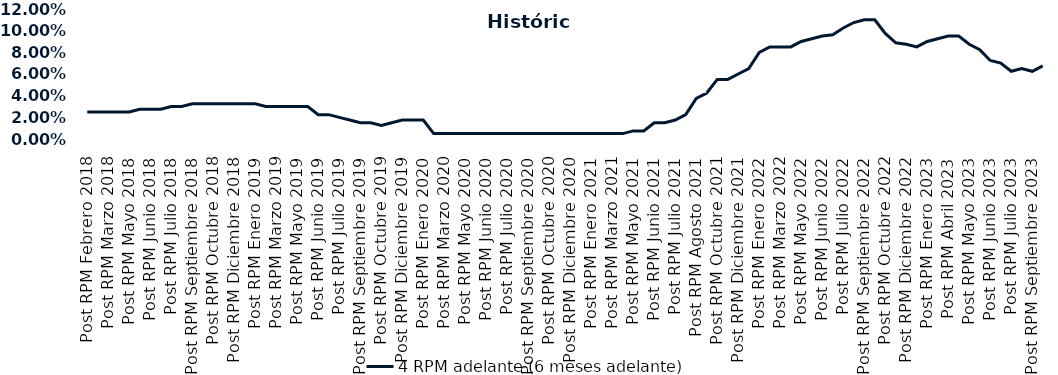
| Category | 4 RPM adelante (6 meses adelante) |
|---|---|
| Post RPM Febrero 2018 | 0.025 |
| Pre RPM Marzo 2018 | 0.025 |
| Post RPM Marzo 2018 | 0.025 |
| Pre RPM Mayo 2018 | 0.025 |
| Post RPM Mayo 2018 | 0.025 |
| Pre RPM Junio 2018 | 0.028 |
| Post RPM Junio 2018 | 0.028 |
| Pre RPM Julio 2018 | 0.028 |
| Post RPM Julio 2018 | 0.03 |
| Pre RPM Septiembre 2018 | 0.03 |
| Post RPM Septiembre 2018 | 0.032 |
| Pre RPM Octubre 2018 | 0.032 |
| Post RPM Octubre 2018 | 0.032 |
| Pre RPM Diciembre 2018 | 0.032 |
| Post RPM Diciembre 2018 | 0.032 |
| Pre RPM Enero 2019 | 0.032 |
| Post RPM Enero 2019 | 0.032 |
| Pre RPM Marzo 2019 | 0.03 |
| Post RPM Marzo 2019 | 0.03 |
| Pre RPM Mayo 2019 | 0.03 |
| Post RPM Mayo 2019 | 0.03 |
| Pre RPM Junio 2019 | 0.03 |
| Post RPM Junio 2019 | 0.022 |
| Pre RPM Julio 2019 | 0.022 |
| Post RPM Julio 2019 | 0.02 |
| Pre RPM Septiembre 2019 | 0.018 |
| Post RPM Septiembre 2019 | 0.015 |
| Pre RPM Octubre 2019 | 0.015 |
| Post RPM Octubre 2019 | 0.012 |
| Pre RPM Diciembre 2019 | 0.015 |
| Post RPM Diciembre 2019 | 0.018 |
| Pre RPM Enero 2020 | 0.018 |
| Post RPM Enero 2020 | 0.018 |
| Pre RPM Marzo 2020 | 0.005 |
| Post RPM Marzo 2020 | 0.005 |
| Pre RPM Mayo 2020 | 0.005 |
| Post RPM Mayo 2020 | 0.005 |
| Pre RPM Junio 2020 | 0.005 |
| Post RPM Junio 2020 | 0.005 |
| Pre RPM Julio 2020 | 0.005 |
| Post RPM Julio 2020 | 0.005 |
| Pre RPM Septiembre 2020 | 0.005 |
| Post RPM Septiembre 2020 | 0.005 |
| Pre RPM Octubre 2020 | 0.005 |
| Post RPM Octubre 2020 | 0.005 |
| Pre RPM Diciembre 2020 | 0.005 |
| Post RPM Diciembre 2020 | 0.005 |
| Pre RPM Enero 2021 | 0.005 |
| Post RPM Enero 2021 | 0.005 |
| Pre RPM Marzo 2021 | 0.005 |
| Post RPM Marzo 2021 | 0.005 |
| Pre RPM Mayo 2021 | 0.005 |
| Post RPM Mayo 2021 | 0.008 |
| Pre RPM Junio 2021 | 0.008 |
| Post RPM Junio 2021 | 0.015 |
| Pre RPM Julio 2021 | 0.015 |
| Post RPM Julio 2021 | 0.018 |
| Pre RPM Agosto 2021 | 0.022 |
| Post RPM Agosto 2021 | 0.038 |
| Pre RPM Octubre 2021 | 0.042 |
| Post RPM Octubre 2021 | 0.055 |
| Pre RPM Diciembre 2021 | 0.055 |
| Post RPM Diciembre 2021 | 0.06 |
| Pre RPM Enero 2022 | 0.065 |
| Post RPM Enero 2022 | 0.08 |
| Pre RPM Marzo 2022 | 0.085 |
| Post RPM Marzo 2022 | 0.085 |
| Pre RPM Mayo 2022 | 0.085 |
| Post RPM Mayo 2022 | 0.09 |
| Pre RPM Junio 2022 | 0.092 |
| Post RPM Junio 2022 | 0.095 |
| Pre RPM Julio 2022 | 0.096 |
| Post RPM Julio 2022 | 0.102 |
| Pre RPM Septiembre 2022 | 0.108 |
| Post RPM Septiembre 2022 | 0.11 |
| Pre RPM Octubre 2022 | 0.11 |
| Post RPM Octubre 2022 | 0.098 |
| Pre RPM Diciembre 2022 | 0.089 |
| Post RPM Diciembre 2022 | 0.088 |
| Pre RPM Enero 2023 | 0.085 |
| Post RPM Enero 2023 | 0.09 |
| Pre RPM Abril 2023 | 0.092 |
| Post RPM Abril 2023 | 0.095 |
| Pre RPM Mayo 2023 | 0.095 |
| Post RPM Mayo 2023 | 0.088 |
| Pre RPM Junio 2023 | 0.082 |
| Post RPM Junio 2023 | 0.072 |
| Pre RPM Julio 2023 | 0.07 |
| Post RPM Julio 2023 | 0.062 |
| Pre RPM Septiembre 2023 | 0.065 |
| Post RPM Septiembre 2023 | 0.062 |
| Pre RPM Octubre 2023 | 0.068 |